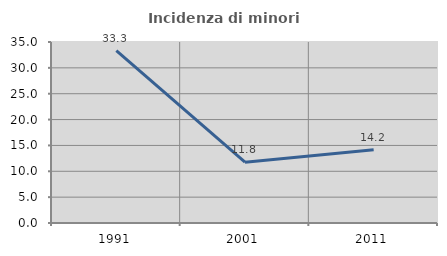
| Category | Incidenza di minori stranieri |
|---|---|
| 1991.0 | 33.333 |
| 2001.0 | 11.765 |
| 2011.0 | 14.173 |